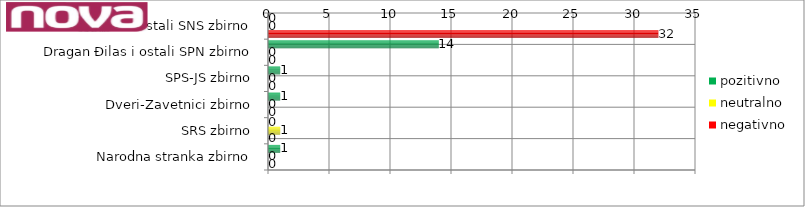
| Category | pozitivno | neutralno | negativno |
|---|---|---|---|
| Aleksandar Vučić i ostali SNS zbirno | 0 | 0 | 32 |
| Dragan Đilas i ostali SPN zbirno | 14 | 0 | 0 |
| SPS-JS zbirno | 1 | 0 | 0 |
| Dveri-Zavetnici zbirno | 1 | 0 | 0 |
| SRS zbirno | 0 | 1 | 0 |
| Narodna stranka zbirno | 1 | 0 | 0 |